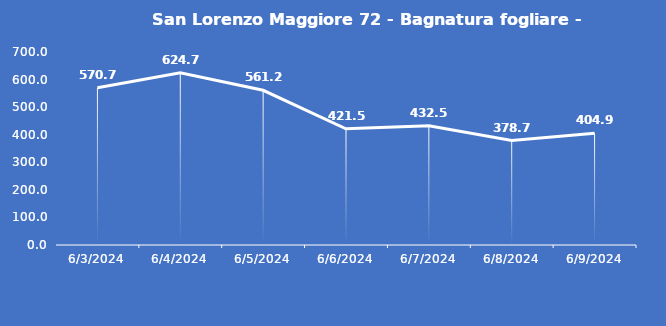
| Category | San Lorenzo Maggiore 72 - Bagnatura fogliare - Grezzo (min) |
|---|---|
| 6/3/24 | 570.7 |
| 6/4/24 | 624.7 |
| 6/5/24 | 561.2 |
| 6/6/24 | 421.5 |
| 6/7/24 | 432.5 |
| 6/8/24 | 378.7 |
| 6/9/24 | 404.9 |